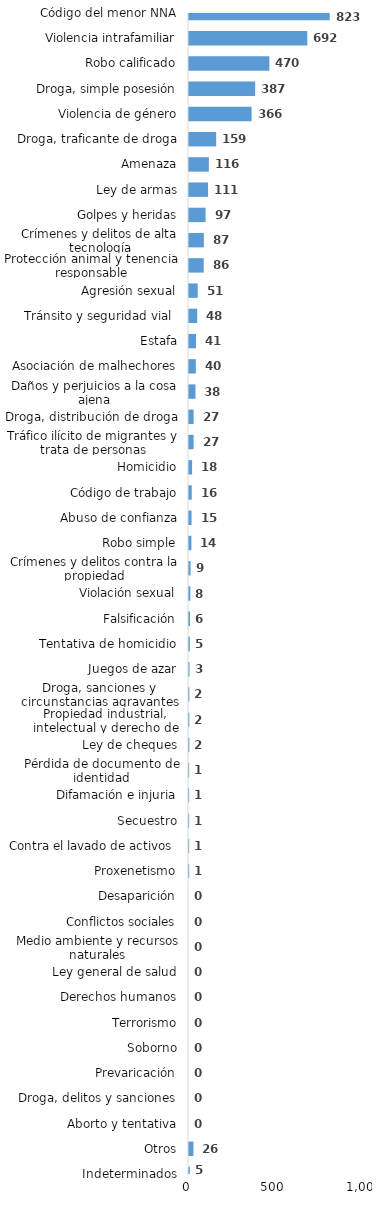
| Category | Series 0 |
|---|---|
| Código del menor NNA | 823 |
| Violencia intrafamiliar | 692 |
| Robo calificado | 470 |
| Droga, simple posesión | 387 |
| Violencia de género | 366 |
| Droga, traficante de droga | 159 |
| Amenaza | 116 |
| Ley de armas | 111 |
| Golpes y heridas | 97 |
| Crímenes y delitos de alta tecnología | 87 |
| Protección animal y tenencia responsable | 86 |
| Agresión sexual | 51 |
| Tránsito y seguridad vial  | 48 |
| Estafa | 41 |
| Asociación de malhechores | 40 |
| Daños y perjuicios a la cosa ajena | 38 |
| Droga, distribución de droga | 27 |
| Tráfico ilícito de migrantes y trata de personas | 27 |
| Homicidio | 18 |
| Código de trabajo | 16 |
| Abuso de confianza | 15 |
| Robo simple | 14 |
| Crímenes y delitos contra la propiedad | 9 |
| Violación sexual | 8 |
| Falsificación | 6 |
| Tentativa de homicidio | 5 |
| Juegos de azar | 3 |
| Droga, sanciones y circunstancias agravantes | 2 |
| Propiedad industrial, intelectual y derecho de autor | 2 |
| Ley de cheques | 2 |
| Pérdida de documento de identidad | 1 |
| Difamación e injuria | 1 |
| Secuestro | 1 |
| Contra el lavado de activos  | 1 |
| Proxenetismo | 1 |
| Desaparición | 0 |
| Conflictos sociales | 0 |
| Medio ambiente y recursos naturales | 0 |
| Ley general de salud | 0 |
| Derechos humanos | 0 |
| Terrorismo | 0 |
| Soborno | 0 |
| Prevaricación | 0 |
| Droga, delitos y sanciones | 0 |
| Aborto y tentativa | 0 |
| Otros | 26 |
| Indeterminados | 5 |